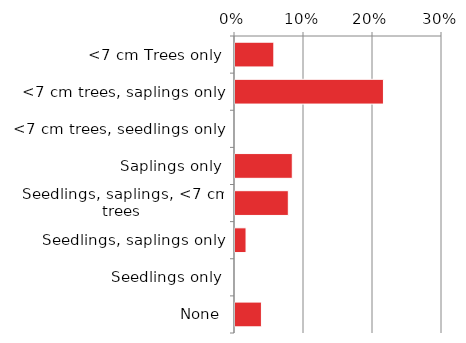
| Category | Non native |
|---|---|
| None | 0.04 |
| Seedlings only | 0 |
| Seedlings, saplings only | 0.017 |
| Seedlings, saplings, <7 cm trees | 0.079 |
| Saplings only | 0.084 |
| <7 cm trees, seedlings only | 0 |
| <7 cm trees, saplings only | 0.217 |
| <7 cm Trees only | 0.058 |